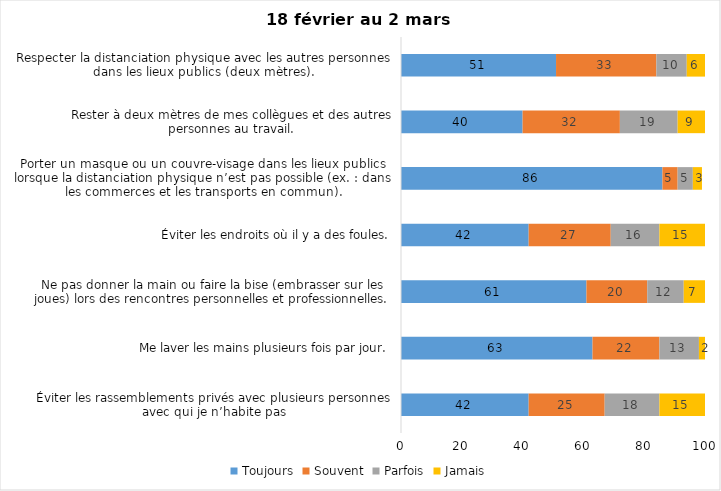
| Category | Toujours | Souvent | Parfois | Jamais |
|---|---|---|---|---|
| Éviter les rassemblements privés avec plusieurs personnes avec qui je n’habite pas | 42 | 25 | 18 | 15 |
| Me laver les mains plusieurs fois par jour. | 63 | 22 | 13 | 2 |
| Ne pas donner la main ou faire la bise (embrasser sur les joues) lors des rencontres personnelles et professionnelles. | 61 | 20 | 12 | 7 |
| Éviter les endroits où il y a des foules. | 42 | 27 | 16 | 15 |
| Porter un masque ou un couvre-visage dans les lieux publics lorsque la distanciation physique n’est pas possible (ex. : dans les commerces et les transports en commun). | 86 | 5 | 5 | 3 |
| Rester à deux mètres de mes collègues et des autres personnes au travail. | 40 | 32 | 19 | 9 |
| Respecter la distanciation physique avec les autres personnes dans les lieux publics (deux mètres). | 51 | 33 | 10 | 6 |